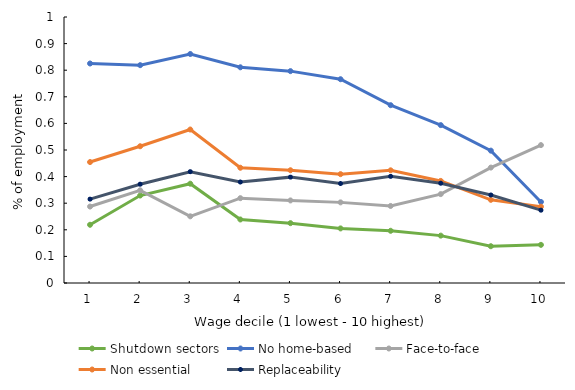
| Category | Shutdown sectors | No home-based | Face-to-face | Non essential | Replaceability |
|---|---|---|---|---|---|
| 1.0 | 0.219 | 0.825 | 0.287 | 0.455 | 0.315 |
| 2.0 | 0.329 | 0.819 | 0.348 | 0.514 | 0.371 |
| 3.0 | 0.373 | 0.861 | 0.251 | 0.577 | 0.418 |
| 4.0 | 0.239 | 0.811 | 0.319 | 0.433 | 0.38 |
| 5.0 | 0.225 | 0.796 | 0.31 | 0.424 | 0.398 |
| 6.0 | 0.205 | 0.766 | 0.303 | 0.409 | 0.374 |
| 7.0 | 0.196 | 0.668 | 0.29 | 0.424 | 0.401 |
| 8.0 | 0.178 | 0.594 | 0.334 | 0.384 | 0.375 |
| 9.0 | 0.138 | 0.498 | 0.434 | 0.313 | 0.331 |
| 10.0 | 0.143 | 0.305 | 0.518 | 0.287 | 0.274 |